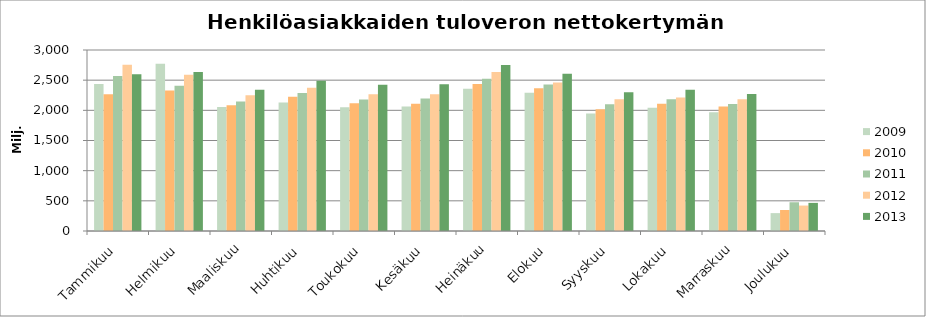
| Category | 2009 | 2010 | 2011 | 2012 | 2013 |
|---|---|---|---|---|---|
| Tammikuu | 2438.489 | 2267.873 | 2569.442 | 2754.468 | 2597.268 |
| Helmikuu | 2771.607 | 2330.409 | 2406.04 | 2591.616 | 2636.607 |
| Maaliskuu | 2054.852 | 2084.249 | 2145.291 | 2250.057 | 2340.316 |
| Huhtikuu | 2131.066 | 2225.487 | 2285.914 | 2375.631 | 2492.368 |
| Toukokuu | 2051.558 | 2117.095 | 2177.688 | 2264.689 | 2423.516 |
| Kesäkuu | 2063.182 | 2109.339 | 2194.481 | 2268.001 | 2432.777 |
| Heinäkuu | 2357.008 | 2435.026 | 2524.383 | 2633.57 | 2750.145 |
| Elokuu | 2289.863 | 2364.596 | 2427.052 | 2461.949 | 2607.529 |
| Syyskuu | 1946.167 | 2019.118 | 2102.001 | 2184.152 | 2299.363 |
| Lokakuu | 2041.676 | 2107.95 | 2185.045 | 2211.144 | 2342.648 |
| Marraskuu | 1967.798 | 2063.457 | 2106.752 | 2183.43 | 2270.307 |
| Joulukuu | 296.354 | 347.927 | 476.484 | 421.857 | 466.039 |